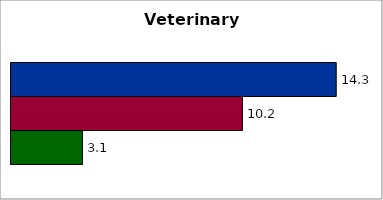
| Category | 50 states and D.C. | SREB states | State |
|---|---|---|---|
| 0 | 14.335 | 10.2 | 3.15 |